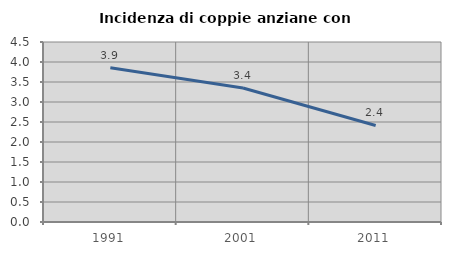
| Category | Incidenza di coppie anziane con figli |
|---|---|
| 1991.0 | 3.857 |
| 2001.0 | 3.351 |
| 2011.0 | 2.413 |